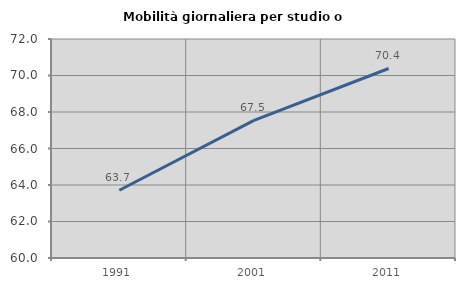
| Category | Mobilità giornaliera per studio o lavoro |
|---|---|
| 1991.0 | 63.711 |
| 2001.0 | 67.54 |
| 2011.0 | 70.385 |